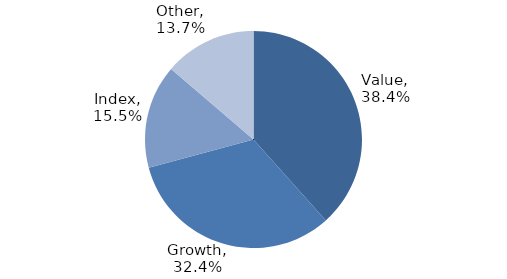
| Category | Investment Style |
|---|---|
| Value | 0.384 |
| Growth | 0.324 |
| Index | 0.155 |
| Other | 0.137 |